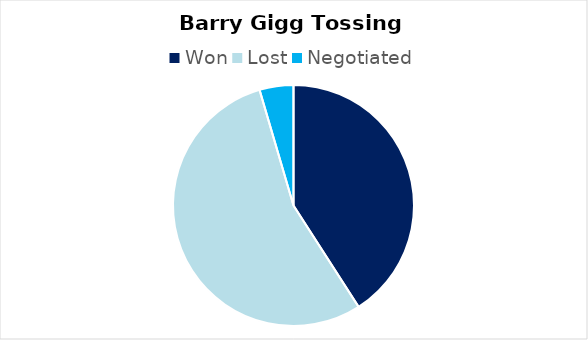
| Category | Barry Gigg |
|---|---|
| Won | 9 |
| Lost | 12 |
| Negotiated | 1 |